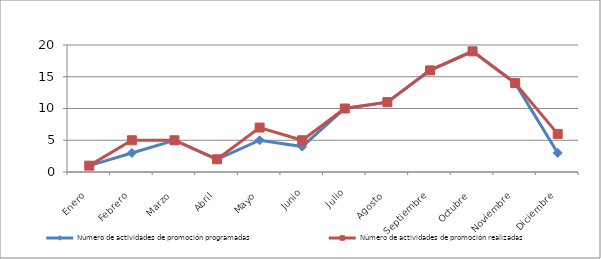
| Category | Número de actividades de promoción programadas | Número de actividades de promoción realizadas |
|---|---|---|
| Enero | 1 | 1 |
| Febrero | 3 | 5 |
| Marzo | 5 | 5 |
| Abril | 2 | 2 |
| Mayo | 5 | 7 |
| Junio | 4 | 5 |
| Julio | 10 | 10 |
| Agosto | 11 | 11 |
| Septiembre | 16 | 16 |
| Octubre | 19 | 19 |
| Noviembre | 14 | 14 |
| Diciembre | 3 | 6 |